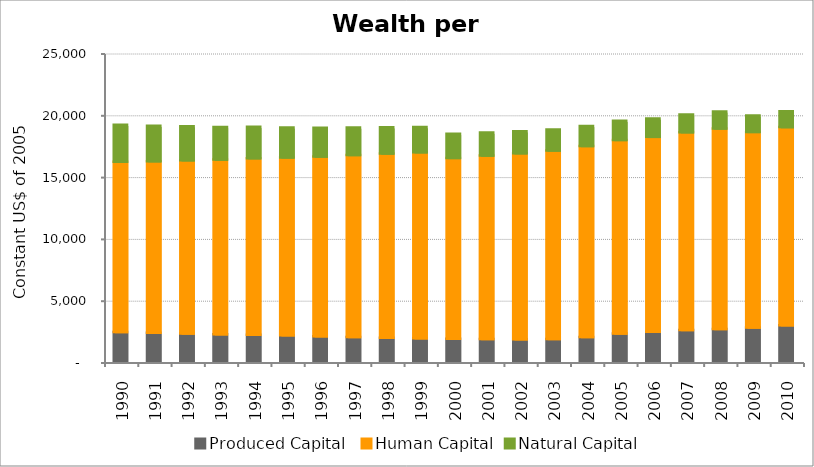
| Category | Produced Capital  | Human Capital | Natural Capital |
|---|---|---|---|
| 1990.0 | 2414.947 | 13773.986 | 2990.855 |
| 1991.0 | 2343.822 | 13884.266 | 2871.719 |
| 1992.0 | 2295.392 | 14008.125 | 2757.974 |
| 1993.0 | 2233.959 | 14123.592 | 2644.971 |
| 1994.0 | 2184.696 | 14288.563 | 2534.176 |
| 1995.0 | 2139.236 | 14394.212 | 2426.89 |
| 1996.0 | 2070.096 | 14531.271 | 2323.903 |
| 1997.0 | 1999.234 | 14729.004 | 2224.155 |
| 1998.0 | 1949.347 | 14898.958 | 2128.272 |
| 1999.0 | 1899.201 | 15052.2 | 2036.096 |
| 2000.0 | 1866.312 | 14627.881 | 1947.044 |
| 2001.0 | 1844.913 | 14831.872 | 1861.661 |
| 2002.0 | 1820.306 | 15050.456 | 1780.358 |
| 2003.0 | 1842.788 | 15248.67 | 1701.913 |
| 2004.0 | 2005.383 | 15451.27 | 1626.774 |
| 2005.0 | 2295.548 | 15652.753 | 1555.524 |
| 2006.0 | 2436.136 | 15757.797 | 1494.89 |
| 2007.0 | 2562.319 | 16009.746 | 1436.735 |
| 2008.0 | 2656.103 | 16213.116 | 1382.356 |
| 2009.0 | 2772.743 | 15825.485 | 1331.359 |
| 2010.0 | 2956.192 | 16026.59 | 1282.123 |